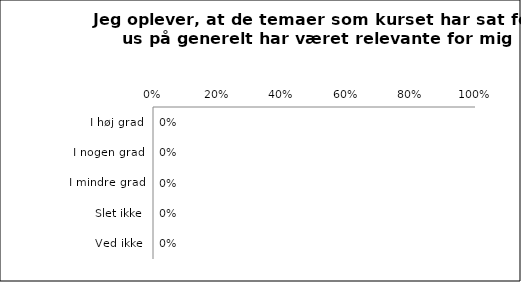
| Category | De temaer som kurset har sat fokus på, har generelt været relevante for mig |
|---|---|
| I høj grad | 0 |
| I nogen grad | 0 |
| I mindre grad | 0 |
| Slet ikke | 0 |
| Ved ikke | 0 |